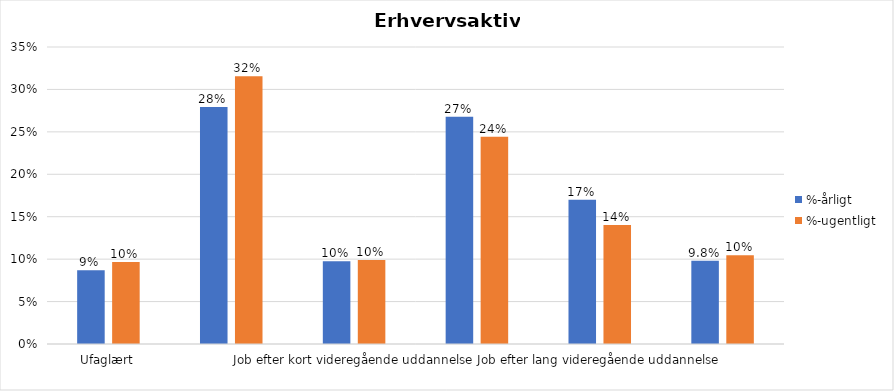
| Category | %-årligt | %-ugentligt |
|---|---|---|
| Ufaglært | 0.087 | 0.097 |
| Erhvervsfagligt job | 0.279 | 0.316 |
| Job efter kort videregående uddannelse | 0.098 | 0.099 |
| Job efter mellemlang videregående uddannelse | 0.268 | 0.244 |
| Job efter lang videregående uddannelse | 0.17 | 0.14 |
| Selvstændig | 0.098 | 0.105 |